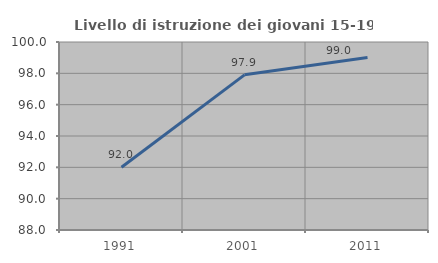
| Category | Livello di istruzione dei giovani 15-19 anni |
|---|---|
| 1991.0 | 92.004 |
| 2001.0 | 97.905 |
| 2011.0 | 99.01 |